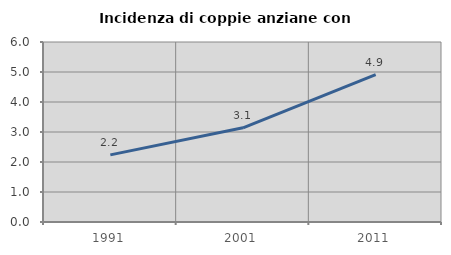
| Category | Incidenza di coppie anziane con figli |
|---|---|
| 1991.0 | 2.238 |
| 2001.0 | 3.141 |
| 2011.0 | 4.915 |